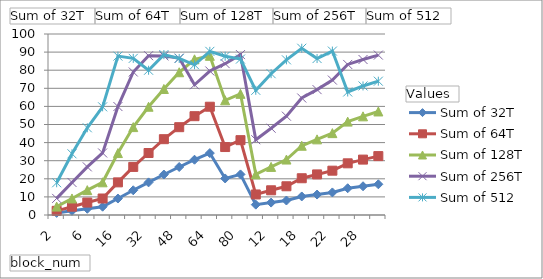
| Category | Sum of 32T | Sum of 64T | Sum of 128T | Sum of 256T | Sum of 512 |
|---|---|---|---|---|---|
| 2 | 1.16 | 2.3 | 4.65 | 9.17 | 17.81 |
| 4 | 2.3 | 4.58 | 9.14 | 17.98 | 33.82 |
| 6 | 3.44 | 6.87 | 13.73 | 26.59 | 48.19 |
| 8 | 4.59 | 9.11 | 18.06 | 34.28 | 59.76 |
| 16 | 9.1 | 18.03 | 34.22 | 59.92 | 87.78 |
| 24 | 13.66 | 26.57 | 48.56 | 79.02 | 86.54 |
| 32 | 18.02 | 34.25 | 59.82 | 88.01 | 79.97 |
| 40 | 22.36 | 41.89 | 69.63 | 87.88 | 88.6 |
| 48 | 26.52 | 48.52 | 78.87 | 86.67 | 86.48 |
| 56 | 30.54 | 54.6 | 86.02 | 71.95 | 83 |
| 64 | 34.2 | 59.82 | 87.95 | 79.55 | 90.41 |
| 72 | 20.2 | 37.55 | 63.38 | 83.61 | 87.7 |
| 80 | 22.42 | 41.35 | 66.94 | 88.62 | 86.15 |
| 10 | 5.72 | 11.35 | 22.44 | 41.59 | 68.88 |
| 12 | 6.86 | 13.65 | 26.58 | 47.94 | 78.07 |
| 14 | 8.01 | 15.87 | 30.63 | 54.6 | 85.72 |
| 18 | 10.24 | 20.31 | 38.26 | 64.63 | 92.13 |
| 20 | 11.3 | 22.42 | 41.79 | 69.27 | 86.44 |
| 22 | 12.47 | 24.49 | 45.23 | 74.55 | 90.57 |
| 26 | 14.78 | 28.55 | 51.6 | 83.18 | 67.96 |
| 28 | 15.88 | 30.61 | 54.51 | 85.92 | 71.3 |
| 30 | 16.97 | 32.54 | 57.2 | 88.35 | 73.93 |